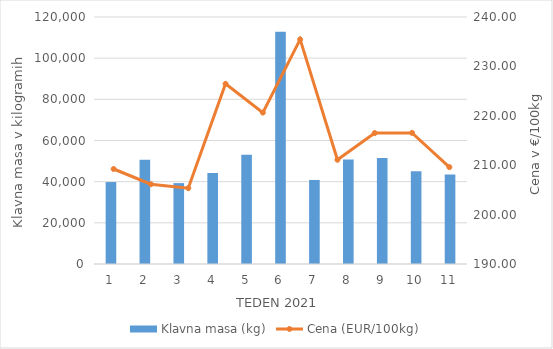
| Category | Klavna masa (kg) |
|---|---|
| 1.0 | 39814 |
| 2.0 | 50603 |
| 3.0 | 39295 |
| 4.0 | 44250 |
| 5.0 | 53061 |
| 6.0 | 112816 |
| 7.0 | 40829 |
| 8.0 | 50775 |
| 9.0 | 51535 |
| 10.0 | 45040 |
| 11.0 | 43536 |